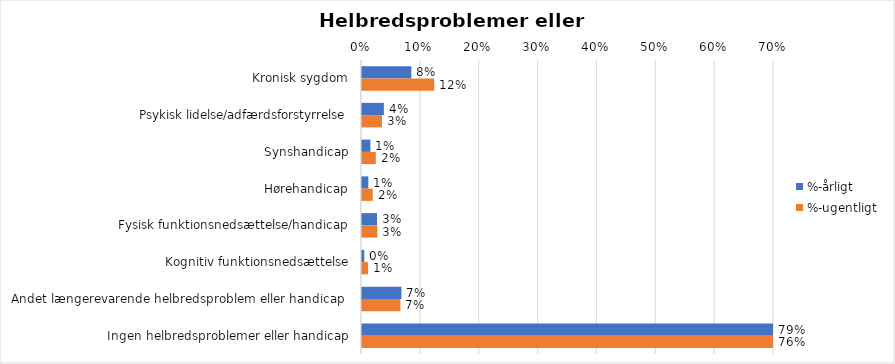
| Category | %-årligt | %-ugentligt |
|---|---|---|
| Kronisk sygdom | 0.084 | 0.123 |
| Psykisk lidelse/adfærdsforstyrrelse | 0.037 | 0.034 |
| Synshandicap | 0.014 | 0.023 |
| Hørehandicap | 0.011 | 0.018 |
| Fysisk funktionsnedsættelse/handicap | 0.026 | 0.026 |
| Kognitiv funktionsnedsættelse | 0.004 | 0.01 |
| Andet længerevarende helbredsproblem eller handicap  | 0.067 | 0.065 |
| Ingen helbredsproblemer eller handicap | 0.793 | 0.762 |